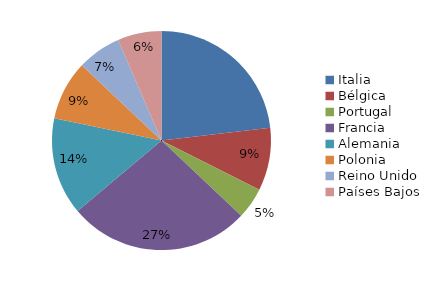
| Category | Series 0 |
|---|---|
| Italia | 50 |
| Bélgica | 20 |
| Portugal | 10 |
| Francia | 58 |
| Alemania | 31 |
| Polonia | 19 |
| Reino Unido | 14 |
| Países Bajos | 14 |